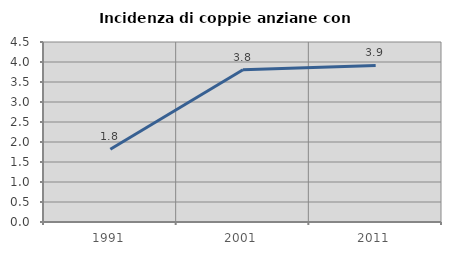
| Category | Incidenza di coppie anziane con figli |
|---|---|
| 1991.0 | 1.818 |
| 2001.0 | 3.807 |
| 2011.0 | 3.914 |